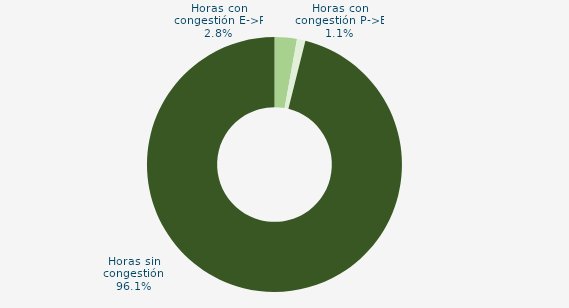
| Category | Horas con congestión E->P |
|---|---|
| Horas con congestión E->P | 2.823 |
| Horas con congestión P->E | 1.075 |
| Horas sin congestión | 96.102 |